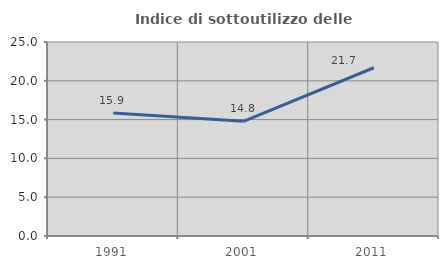
| Category | Indice di sottoutilizzo delle abitazioni  |
|---|---|
| 1991.0 | 15.854 |
| 2001.0 | 14.778 |
| 2011.0 | 21.681 |